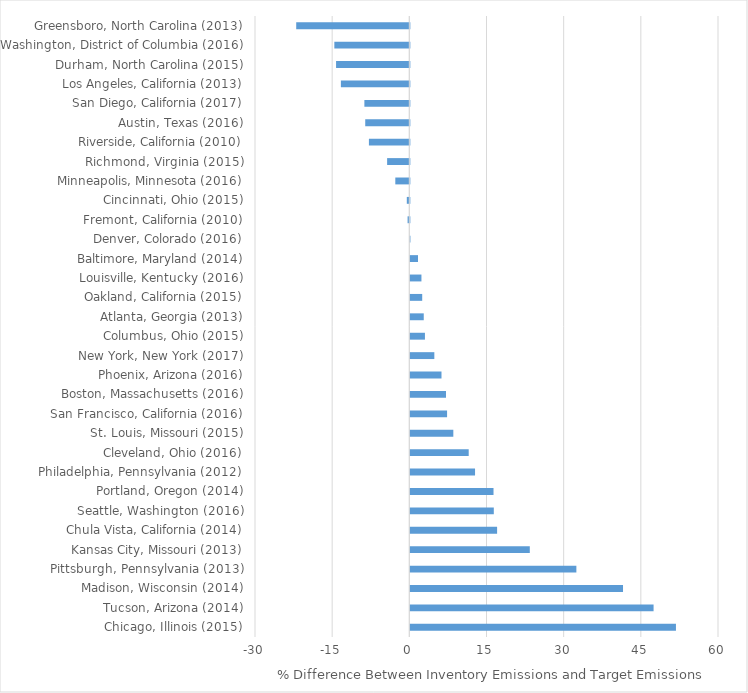
| Category | Series 0 |
|---|---|
| Chicago, Illinois (2015) | 51.632 |
| Tucson, Arizona (2014) | 47.283 |
| Madison, Wisconsin (2014) | 41.342 |
| Pittsburgh, Pennsylvania (2013) | 32.275 |
| Kansas City, Missouri (2013) | 23.222 |
| Chula Vista, California (2014) | 16.867 |
| Seattle, Washington (2016) | 16.224 |
| Portland, Oregon (2014) | 16.169 |
| Philadelphia, Pennsylvania (2012) | 12.579 |
| Cleveland, Ohio (2016) | 11.346 |
| St. Louis, Missouri (2015) | 8.357 |
| San Francisco, California (2016) | 7.143 |
| Boston, Massachusetts (2016) | 6.933 |
| Phoenix, Arizona (2016) | 6.056 |
| New York, New York (2017) | 4.666 |
| Columbus, Ohio (2015) | 2.839 |
| Atlanta, Georgia (2013) | 2.609 |
| Oakland, California (2015) | 2.309 |
| Louisville, Kentucky (2016) | 2.159 |
| Baltimore, Maryland (2014) | 1.494 |
| Denver, Colorado (2016) | 0.014 |
| Fremont, California (2010) | -0.34 |
| Cincinnati, Ohio (2015) | -0.491 |
| Minneapolis, Minnesota (2016) | -2.726 |
| Richmond, Virginia (2015) | -4.318 |
| Riverside, California (2010) | -7.857 |
| Austin, Texas (2016) | -8.572 |
| San Diego, California (2017) | -8.739 |
| Los Angeles, California (2013) | -13.305 |
| Durham, North Carolina (2015) | -14.241 |
| Washington, District of Columbia (2016) | -14.577 |
| Greensboro, North Carolina (2013) | -21.989 |